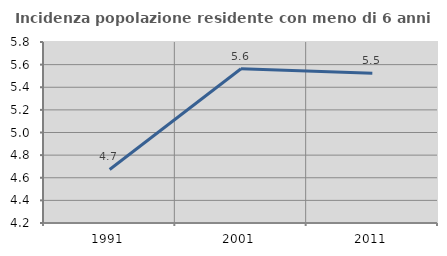
| Category | Incidenza popolazione residente con meno di 6 anni |
|---|---|
| 1991.0 | 4.673 |
| 2001.0 | 5.563 |
| 2011.0 | 5.523 |